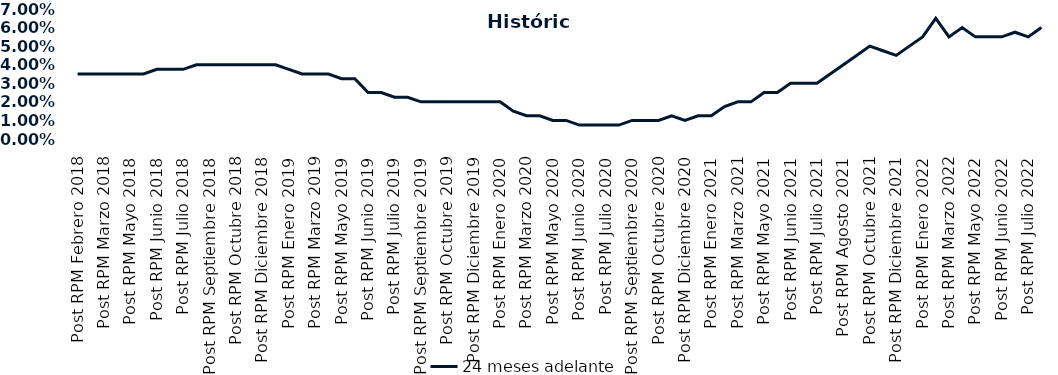
| Category | 24 meses adelante  |
|---|---|
| Post RPM Febrero 2018 | 0.035 |
| Pre RPM Marzo 2018 | 0.035 |
| Post RPM Marzo 2018 | 0.035 |
| Pre RPM Mayo 2018 | 0.035 |
| Post RPM Mayo 2018 | 0.035 |
| Pre RPM Junio 2018 | 0.035 |
| Post RPM Junio 2018 | 0.038 |
| Pre RPM Julio 2018 | 0.038 |
| Post RPM Julio 2018 | 0.038 |
| Pre RPM Septiembre 2018 | 0.04 |
| Post RPM Septiembre 2018 | 0.04 |
| Pre RPM Octubre 2018 | 0.04 |
| Post RPM Octubre 2018 | 0.04 |
| Pre RPM Diciembre 2018 | 0.04 |
| Post RPM Diciembre 2018 | 0.04 |
| Pre RPM Enero 2019 | 0.04 |
| Post RPM Enero 2019 | 0.038 |
| Pre RPM Marzo 2019 | 0.035 |
| Post RPM Marzo 2019 | 0.035 |
| Pre RPM Mayo 2019 | 0.035 |
| Post RPM Mayo 2019 | 0.032 |
| Pre RPM Junio 2019 | 0.032 |
| Post RPM Junio 2019 | 0.025 |
| Pre RPM Julio 2019 | 0.025 |
| Post RPM Julio 2019 | 0.022 |
| Pre RPM Septiembre 2019 | 0.022 |
| Post RPM Septiembre 2019 | 0.02 |
| Pre RPM Octubre 2019 | 0.02 |
| Post RPM Octubre 2019 | 0.02 |
| Pre RPM Diciembre 2019 | 0.02 |
| Post RPM Diciembre 2019 | 0.02 |
| Pre RPM Enero 2020 | 0.02 |
| Post RPM Enero 2020 | 0.02 |
| Pre RPM Marzo 2020 | 0.015 |
| Post RPM Marzo 2020 | 0.012 |
| Pre RPM Mayo 2020 | 0.012 |
| Post RPM Mayo 2020 | 0.01 |
| Pre RPM Junio 2020 | 0.01 |
| Post RPM Junio 2020 | 0.008 |
| Pre RPM Julio 2020 | 0.008 |
| Post RPM Julio 2020 | 0.008 |
| Pre RPM Septiembre 2020 | 0.008 |
| Post RPM Septiembre 2020 | 0.01 |
| Pre RPM Octubre 2020 | 0.01 |
| Post RPM Octubre 2020 | 0.01 |
| Pre RPM Diciembre 2020 | 0.012 |
| Post RPM Diciembre 2020 | 0.01 |
| Pre RPM Enero 2021 | 0.012 |
| Post RPM Enero 2021 | 0.012 |
| Pre RPM Marzo 2021 | 0.018 |
| Post RPM Marzo 2021 | 0.02 |
| Pre RPM Mayo 2021 | 0.02 |
| Post RPM Mayo 2021 | 0.025 |
| Pre RPM Junio 2021 | 0.025 |
| Post RPM Junio 2021 | 0.03 |
| Pre RPM Julio 2021 | 0.03 |
| Post RPM Julio 2021 | 0.03 |
| Pre RPM Agosto 2021 | 0.035 |
| Post RPM Agosto 2021 | 0.04 |
| Pre RPM Octubre 2021 | 0.045 |
| Post RPM Octubre 2021 | 0.05 |
| Pre RPM Diciembre 2021 | 0.048 |
| Post RPM Diciembre 2021 | 0.045 |
| Pre RPM Enero 2022 | 0.05 |
| Post RPM Enero 2022 | 0.055 |
| Pre RPM Marzo 2022 | 0.065 |
| Post RPM Marzo 2022 | 0.055 |
| Pre RPM Mayo 2022 | 0.06 |
| Post RPM Mayo 2022 | 0.055 |
| Pre RPM Junio 2022 | 0.055 |
| Post RPM Junio 2022 | 0.055 |
| Pre RPM Julio 2022 | 0.058 |
| Post RPM Julio 2022 | 0.055 |
| Pre RPM Septiembre 2022 | 0.06 |